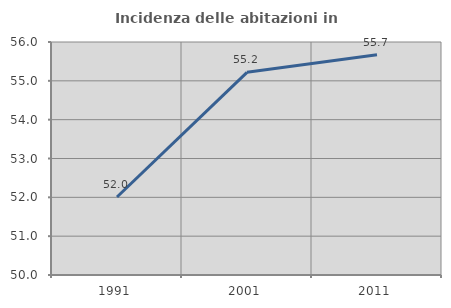
| Category | Incidenza delle abitazioni in proprietà  |
|---|---|
| 1991.0 | 52.009 |
| 2001.0 | 55.22 |
| 2011.0 | 55.669 |